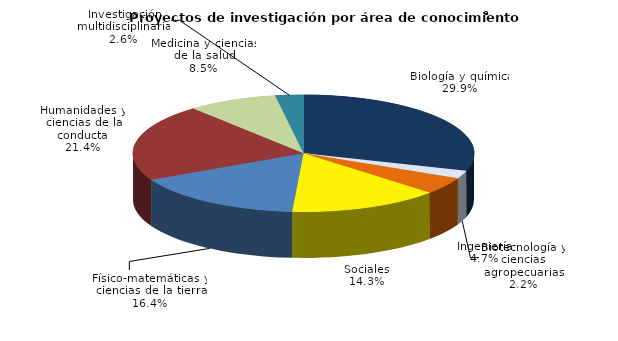
| Category | Series 0 |
|---|---|
| Biología y química | 0.299 |
| Biotecnología y ciencias agropecuarias | 0.022 |
| Ingeniería | 0.047 |
| Sociales | 0.143 |
| Físico-matemáticas y ciencias de la tierra | 0.164 |
| Humanidades y ciencias de la conducta | 0.214 |
| Medicina y ciencias de la salud | 0.085 |
| Investigación multidisciplinaria | 0.026 |